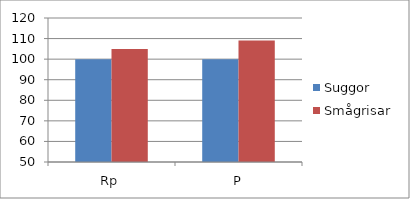
| Category | Suggor | Smågrisar |
|---|---|---|
| Rp | 100 | 104.972 |
| P | 100 | 109.091 |